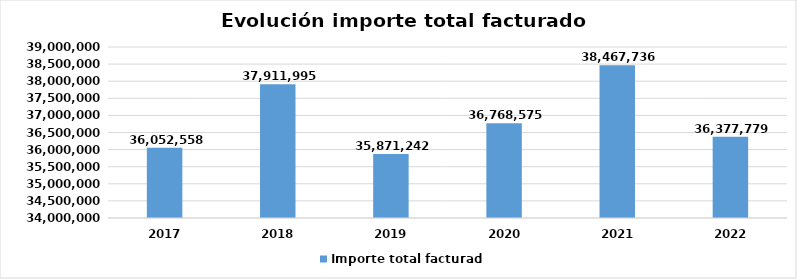
| Category | Importe total facturado |
|---|---|
| 2017.0 | 36052558 |
| 2018.0 | 37911995.42 |
| 2019.0 | 35871241.55 |
| 2020.0 | 36768575.42 |
| 2021.0 | 38467736 |
| 2022.0 | 36377778.66 |